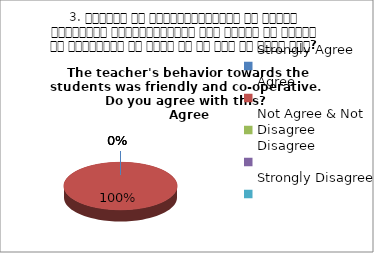
| Category | 3. शिक्षक का विद्यार्थियों के प्रति व्यव्हार मित्रतापूर्ण एवं सहयोग के भावना से परिपूर्ण था क्या आप इस बात से सहमत हैं? 
The teacher's behavior towards the students was friendly and co-operative.  Do you agree with this? 
 Agree |
|---|---|
| Strongly Agree | 0 |
| Agree | 1 |
| Not Agree & Not Disagree | 0 |
| Disagree | 0 |
| Strongly Disagree | 0 |